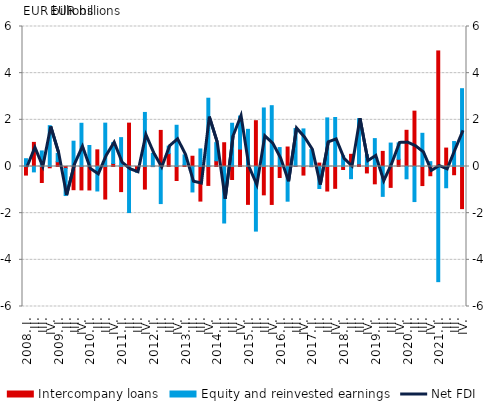
| Category | Intercompany loans | Equity and reinvested earnings |
|---|---|---|
| 2008. I. | -0.368 | 0.334 |
| II. | 1.034 | -0.231 |
| III. | -0.685 | 0.667 |
| IV. | -0.056 | 1.75 |
| 2009. I. | 0.204 | 0.359 |
| II. | -0.082 | -1.163 |
| III. | -0.994 | 1.084 |
| IV. | -1.003 | 1.852 |
| 2010. I. | -1.006 | 0.9 |
| II. | 0.714 | -1.049 |
| III. | -1.395 | 1.858 |
| IV. | 0.13 | 0.893 |
| 2011. I. | -1.076 | 1.238 |
| II. | 1.858 | -1.975 |
| III. | -0.199 | -0.045 |
| IV. | -0.968 | 2.317 |
| 2012. I. | -0.004 | 0.564 |
| II. | 1.547 | -1.589 |
| III. | 0.553 | 0.32 |
| IV. | -0.601 | 1.767 |
| 2013. I. | 0.068 | 0.429 |
| II. | 0.44 | -1.091 |
| III. | -1.483 | 0.753 |
| IV. | -0.811 | 2.927 |
| 2014. I. | 0.246 | 0.777 |
| II. | 1.019 | -2.421 |
| III. | -0.558 | 1.854 |
| IV. | 0.746 | 1.416 |
| 2015. I. | -1.622 | 1.593 |
| II. | 1.963 | -2.769 |
| III. | -1.215 | 2.509 |
| IV. | -1.626 | 2.607 |
| 2016. I. | -0.471 | 0.811 |
| II. | 0.835 | -1.486 |
| III. | 0.022 | 1.608 |
| IV. | -0.367 | 1.611 |
| 2017. I. | -0.008 | 0.724 |
| II. | 0.146 | -0.943 |
| III. | -1.051 | 2.083 |
| IV. | -0.935 | 2.099 |
| 2018. I. | -0.128 | 0.457 |
| II. | 0.522 | -0.522 |
| III. | 0.109 | 1.941 |
| IV. | -0.276 | 0.509 |
| 2019. I. | -0.743 | 1.196 |
| II. | 0.647 | -1.28 |
| III. | -0.895 | 1.004 |
| IV. | 0.309 | 0.702 |
| 2020. I. | 1.552 | -0.527 |
| II. | 2.372 | -1.503 |
| III. | -0.817 | 1.423 |
| IV. | -0.396 | 0.207 |
| 2021. I. | 4.953 | -4.935 |
| II. | 0.79 | -0.911 |
| III. | -0.353 | 1.069 |
| IV. | -1.806 | 3.335 |